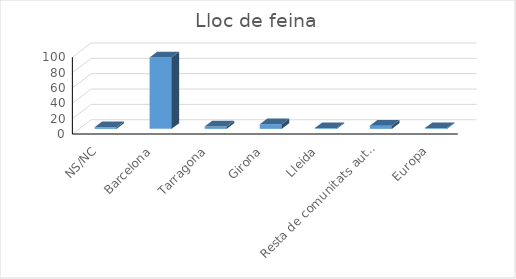
| Category | Series 0 |
|---|---|
| NS/NC | 2 |
| Barcelona | 93 |
| Tarragona | 3 |
| Girona | 6 |
| Lleida | 1 |
| Resta de comunitats autònomes | 4 |
| Europa | 1 |